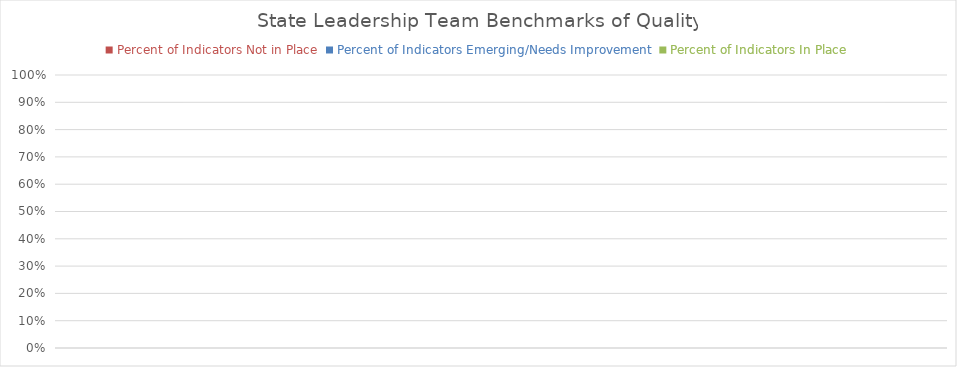
| Category | Percent of Indicators Not in Place | Percent of Indicators Emerging/Needs Improvement | Percent of Indicators In Place |
|---|---|---|---|
| 0 | 0 | 0 | 0 |
| 1 | 0 | 0 | 0 |
| 2 | 0 | 0 | 0 |
| 3 | 0 | 0 | 0 |
| 4 | 0 | 0 | 0 |
| 5 | 0 | 0 | 0 |